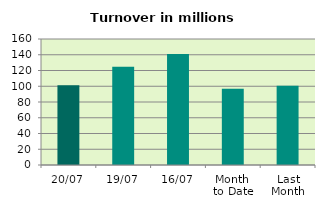
| Category | Series 0 |
|---|---|
| 20/07 | 101.18 |
| 19/07 | 124.812 |
| 16/07 | 140.795 |
| Month 
to Date | 96.788 |
| Last
Month | 100.537 |